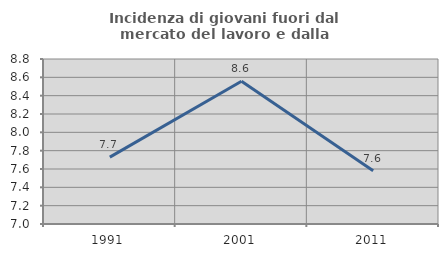
| Category | Incidenza di giovani fuori dal mercato del lavoro e dalla formazione  |
|---|---|
| 1991.0 | 7.729 |
| 2001.0 | 8.557 |
| 2011.0 | 7.582 |